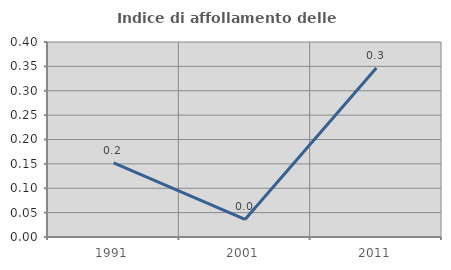
| Category | Indice di affollamento delle abitazioni  |
|---|---|
| 1991.0 | 0.152 |
| 2001.0 | 0.036 |
| 2011.0 | 0.347 |